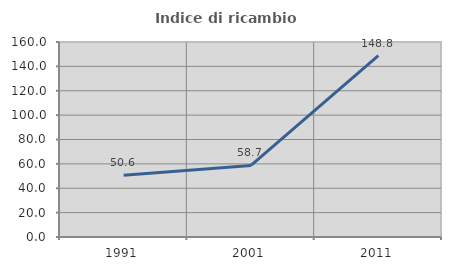
| Category | Indice di ricambio occupazionale  |
|---|---|
| 1991.0 | 50.617 |
| 2001.0 | 58.696 |
| 2011.0 | 148.837 |